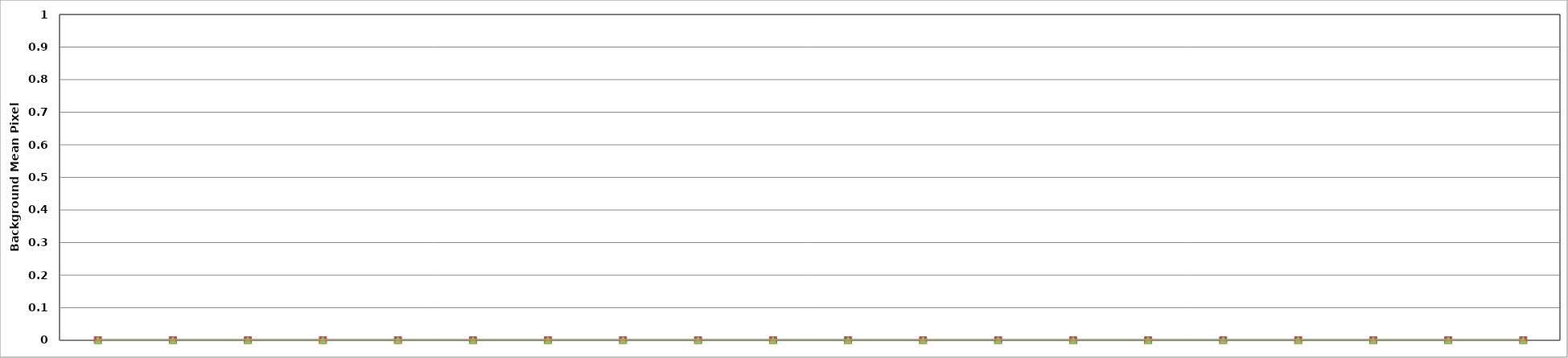
| Category | MPV | MPV baseline +10% | MPV baseline -10% |
|---|---|---|---|
|  |  | 0 | 0 |
|  |  | 0 | 0 |
|  |  | 0 | 0 |
|  |  | 0 | 0 |
|  |  | 0 | 0 |
|  |  | 0 | 0 |
|  |  | 0 | 0 |
|  |  | 0 | 0 |
|  |  | 0 | 0 |
|  |  | 0 | 0 |
|  |  | 0 | 0 |
|  |  | 0 | 0 |
|  |  | 0 | 0 |
|  |  | 0 | 0 |
|  |  | 0 | 0 |
|  |  | 0 | 0 |
|  |  | 0 | 0 |
|  |  | 0 | 0 |
|  |  | 0 | 0 |